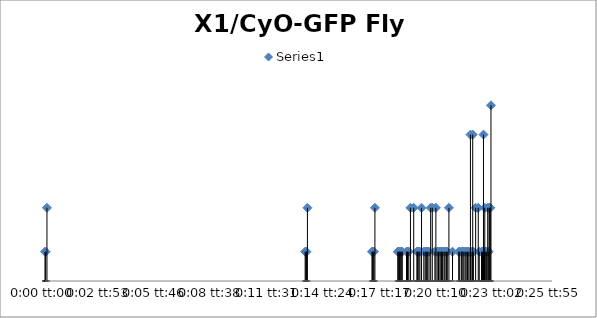
| Category | Series 0 |
|---|---|
| 0.0 | 2 |
| 2.3148148148133263e-05 | 2 |
| 6.94444444444553e-05 | 5 |
| 0.009236111111111112 | 2 |
| 0.009259259259259245 | 2 |
| 0.009282407407407406 | 2 |
| 0.009317129629629634 | 5 |
| 0.011608796296296298 | 2 |
| 0.011631944444444431 | 2 |
| 0.011655092592592592 | 2 |
| 0.011678240740740753 | 2 |
| 0.01171296296296298 | 5 |
| 0.012523148148148172 | 2 |
| 0.012546296296296278 | 2 |
| 0.012581018518518505 | 2 |
| 0.0125925925925926 | 2 |
| 0.012627314814814827 | 2 |
| 0.01265046296296296 | 2 |
| 0.012685185185185188 | 2 |
| 0.012835648148148138 | 2 |
| 0.012858796296296299 | 2 |
| 0.012870370370370365 | 2 |
| 0.01288194444444446 | 2 |
| 0.012916666666666687 | 2 |
| 0.012974537037037048 | 5 |
| 0.01309027777777777 | 5 |
| 0.013206018518518547 | 2 |
| 0.013217592592592614 | 2 |
| 0.013240740740740775 | 2 |
| 0.013275462962962947 | 2 |
| 0.013310185185185175 | 2 |
| 0.013368055555555564 | 5 |
| 0.013449074074074086 | 2 |
| 0.013495370370370352 | 2 |
| 0.01353009259259258 | 2 |
| 0.01355324074074074 | 2 |
| 0.013587962962962968 | 2 |
| 0.013634259259259263 | 2 |
| 0.013692129629629651 | 5 |
| 0.013749999999999984 | 5 |
| 0.0138425925925926 | 2 |
| 0.013877314814814828 | 5 |
| 0.013923611111111123 | 2 |
| 0.01396990740740739 | 2 |
| 0.01399305555555555 | 2 |
| 0.014050925925925939 | 2 |
| 0.014074074074074072 | 2 |
| 0.0141087962962963 | 2 |
| 0.01413194444444446 | 2 |
| 0.01418981481481485 | 2 |
| 0.014236111111111116 | 2 |
| 0.01425925925925925 | 2 |
| 0.01428240740740741 | 2 |
| 0.014340277777777799 | 5 |
| 0.014467592592592587 | 2 |
| 0.014687499999999992 | 2 |
| 0.01472222222222222 | 2 |
| 0.014780092592592609 | 2 |
| 0.014803240740740742 | 2 |
| 0.01483796296296297 | 2 |
| 0.014872685185185197 | 2 |
| 0.01491898148148152 | 2 |
| 0.014953703703703691 | 2 |
| 0.015000000000000013 | 2 |
| 0.015046296296296308 | 2 |
| 0.015092592592592602 | 2 |
| 0.015104166666666696 | 10 |
| 0.01512731481481483 | 2 |
| 0.015173611111111096 | 2 |
| 0.01518518518518519 | 10 |
| 0.015208333333333324 | 2 |
| 0.015289351851851873 | 5 |
| 0.015381944444444462 | 5 |
| 0.015416666666666662 | 2 |
| 0.015497685185185184 | 2 |
| 0.015532407407407411 | 2 |
| 0.015555555555555572 | 2 |
| 0.015567129629629639 | 10 |
| 0.015578703703703733 | 2 |
| 0.015601851851851867 | 2 |
| 0.015613425925925906 | 5 |
| 0.015648148148148133 | 2 |
| 0.015671296296296294 | 2 |
| 0.01571759259259259 | 5 |
| 0.015752314814814816 | 2 |
| 0.01576388888888891 | 5 |
| 0.015787037037037044 | 5 |
| 0.015810185185185205 | 5 |
| 0.01583333333333331 | 12 |